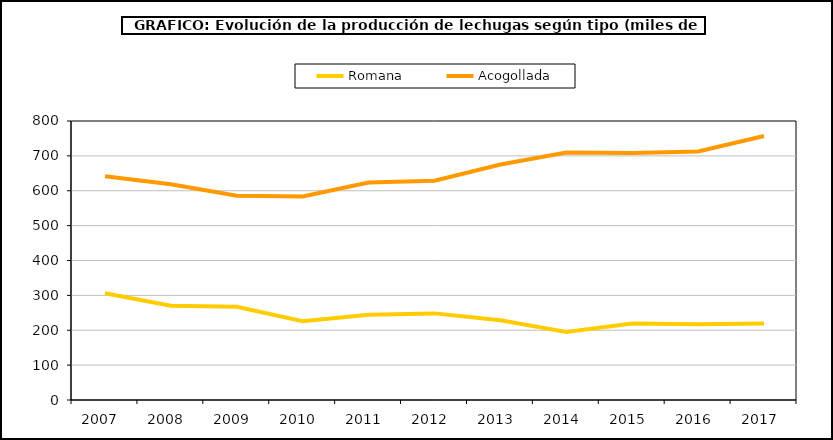
| Category | Romana | Acogollada |
|---|---|---|
| 2007.0 | 306.019 | 641.593 |
| 2008.0 | 270.572 | 618.661 |
| 2009.0 | 267.562 | 585.426 |
| 2010.0 | 225.829 | 583.561 |
| 2011.0 | 244.577 | 623.859 |
| 2012.0 | 248.374 | 628.552 |
| 2013.0 | 228.928 | 675.355 |
| 2014.0 | 195.068 | 709.734 |
| 2015.0 | 219.245 | 708.133 |
| 2016.0 | 217.427 | 712.517 |
| 2017.0 | 219.317 | 756.795 |